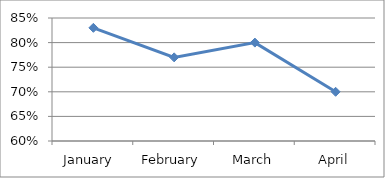
| Category | ACCURACY |
|---|---|
| January  | 0.83 |
| February | 0.77 |
| March | 0.8 |
| April | 0.7 |